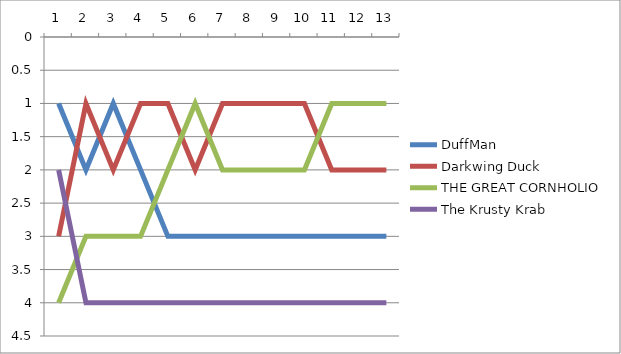
| Category | DuffMan | Darkwing Duck | THE GREAT CORNHOLIO | The Krusty Krab |
|---|---|---|---|---|
| 0 | 1 | 3 | 4 | 2 |
| 1 | 2 | 1 | 3 | 4 |
| 2 | 1 | 2 | 3 | 4 |
| 3 | 2 | 1 | 3 | 4 |
| 4 | 3 | 1 | 2 | 4 |
| 5 | 3 | 2 | 1 | 4 |
| 6 | 3 | 1 | 2 | 4 |
| 7 | 3 | 1 | 2 | 4 |
| 8 | 3 | 1 | 2 | 4 |
| 9 | 3 | 1 | 2 | 4 |
| 10 | 3 | 2 | 1 | 4 |
| 11 | 3 | 2 | 1 | 4 |
| 12 | 3 | 2 | 1 | 4 |